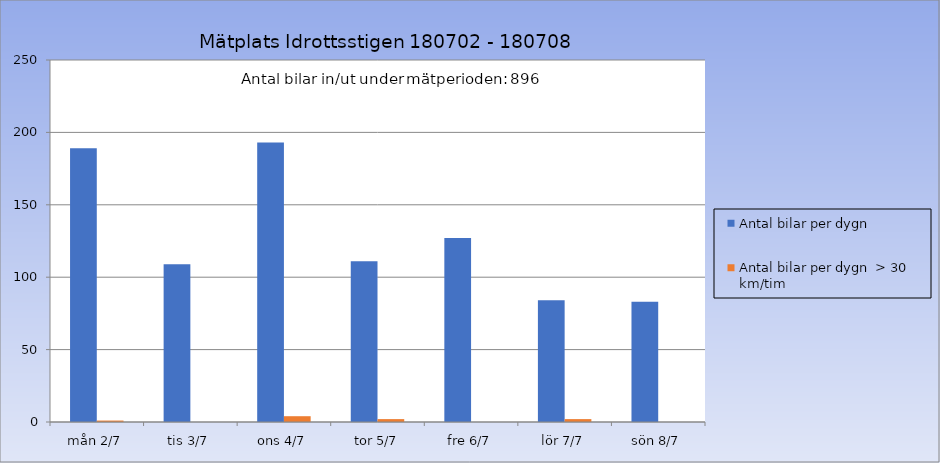
| Category | Antal bilar per dygn | Antal bilar per dygn  > 30 km/tim |
|---|---|---|
| mån 2/7 | 189 | 1 |
| tis 3/7 | 109 | 0 |
| ons 4/7 | 193 | 4 |
| tor 5/7 | 111 | 2 |
| fre 6/7 | 127 | 0 |
| lör 7/7 | 84 | 2 |
| sön 8/7 | 83 | 0 |